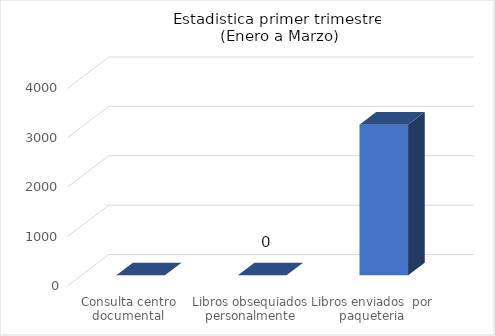
| Category | Enero a Marzo |
|---|---|
| Consulta centro documental | 0 |
| Libros obsequiados personalmente | 0 |
| Libros enviados  por paqueteria | 3050 |